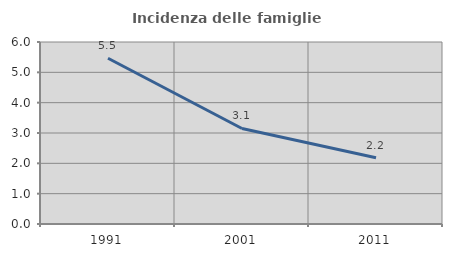
| Category | Incidenza delle famiglie numerose |
|---|---|
| 1991.0 | 5.464 |
| 2001.0 | 3.149 |
| 2011.0 | 2.183 |